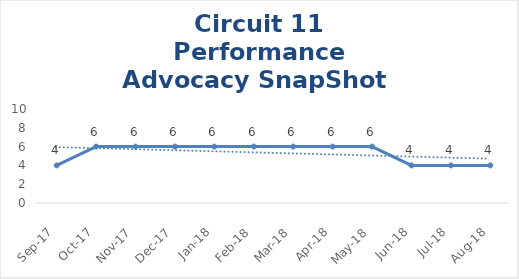
| Category | Circuit 11 |
|---|---|
| Sep-17 | 4 |
| Oct-17 | 6 |
| Nov-17 | 6 |
| Dec-17 | 6 |
| Jan-18 | 6 |
| Feb-18 | 6 |
| Mar-18 | 6 |
| Apr-18 | 6 |
| May-18 | 6 |
| Jun-18 | 4 |
| Jul-18 | 4 |
| Aug-18 | 4 |